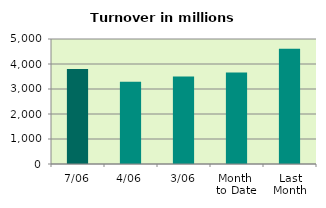
| Category | Series 0 |
|---|---|
| 7/06 | 3802.406 |
| 4/06 | 3287.768 |
| 3/06 | 3504.99 |
| Month 
to Date | 3657.801 |
| Last
Month | 4609.327 |